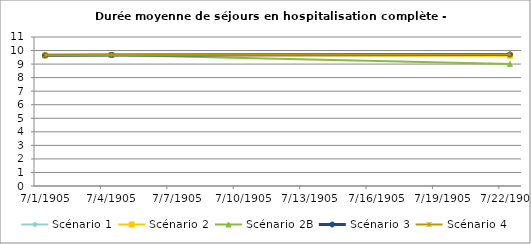
| Category | Scénario 1 | Scénario 2 | Scénario 2B | Scénario 3 | Scénario 4 |
|---|---|---|---|---|---|
| 2009.0 | 9.647 | 9.647 | 9.647 | 9.647 | 9.647 |
| 2012.0 | 9.679 | 9.679 | 9.679 | 9.679 | 9.679 |
| 2030.0 | 9.714 | 9.62 | 9.01 | 9.714 | 9.714 |